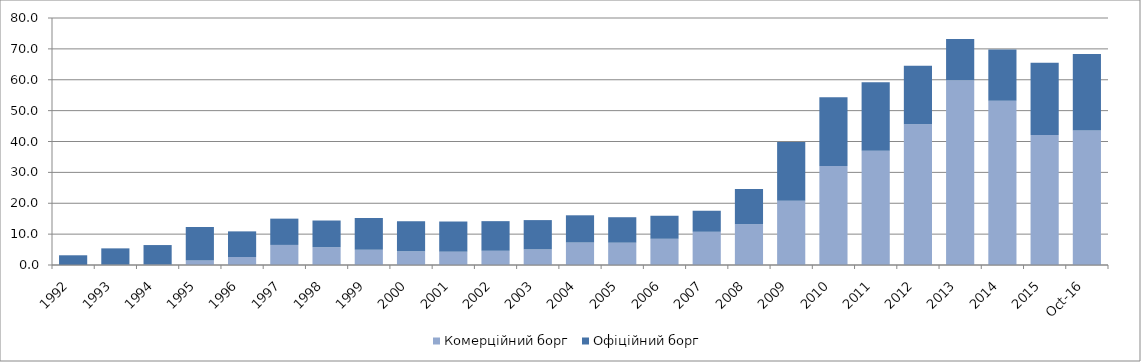
| Category | Комерційний борг | Офіційний борг |
|---|---|---|
| 1992.0 | 0.002 | 3.145 |
| 1993.0 | 0.093 | 5.294 |
| 1994.0 | 0.141 | 6.319 |
| 1995.0 | 1.452 | 10.845 |
| 1996.0 | 2.584 | 8.306 |
| 1997.0 | 6.501 | 8.515 |
| 1998.0 | 5.762 | 8.647 |
| 1999.0 | 4.91 | 10.338 |
| 2000.0 | 4.437 | 9.735 |
| 2001.0 | 4.31 | 9.775 |
| 2002.0 | 4.609 | 9.593 |
| 2003.0 | 5.066 | 9.477 |
| 2004.0 | 7.274 | 8.823 |
| 2005.0 | 7.225 | 8.249 |
| 2006.0 | 8.489 | 7.461 |
| 2007.0 | 10.762 | 6.811 |
| 2008.0 | 13.215 | 11.384 |
| 2009.0 | 20.831 | 18.982 |
| 2010.0 | 32.087 | 22.211 |
| 2011.0 | 37.025 | 22.198 |
| 2012.0 | 45.621 | 18.875 |
| 2013.0 | 59.842 | 13.321 |
| 2014.0 | 53.19 | 16.622 |
| 2015.0 | 42.095 | 23.41 |
| 42674.0 | 43.549 | 24.801 |